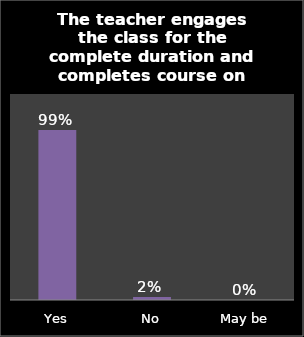
| Category | Series 0 |
|---|---|
| Yes | 0.99 |
| No | 0.018 |
| May be | 0 |